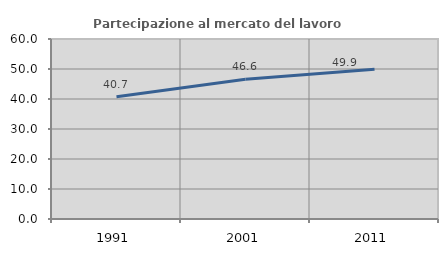
| Category | Partecipazione al mercato del lavoro  femminile |
|---|---|
| 1991.0 | 40.726 |
| 2001.0 | 46.597 |
| 2011.0 | 49.946 |